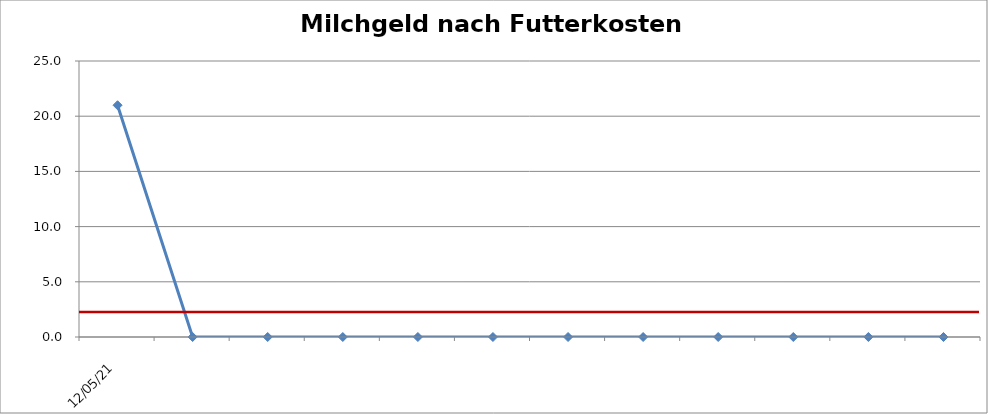
| Category | Milchgeld nach Futterkosten (ct/kg)   |
|---|---|
| 12.05.21 | 20.994 |
|    | 0 |
|    | 0 |
|    | 0 |
|    | 0 |
|    | 0 |
|    | 0 |
|    | 0 |
|    | 0 |
|    | 0 |
|    | 0 |
|    | 0 |